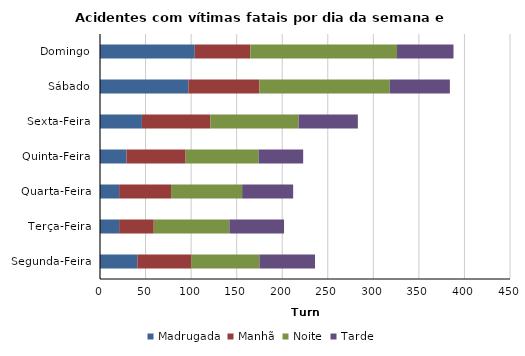
| Category | Madrugada | Manhã | Noite | Tarde |
|---|---|---|---|---|
| Segunda-Feira | 41 | 59 | 75 | 61 |
| Terça-Feira | 21 | 38 | 83 | 60 |
| Quarta-Feira | 21 | 57 | 78 | 56 |
| Quinta-Feira | 29 | 65 | 80 | 49 |
| Sexta-Feira | 46 | 75 | 97 | 65 |
| Sábado | 97 | 78 | 143 | 66 |
| Domingo | 104 | 61 | 161 | 62 |